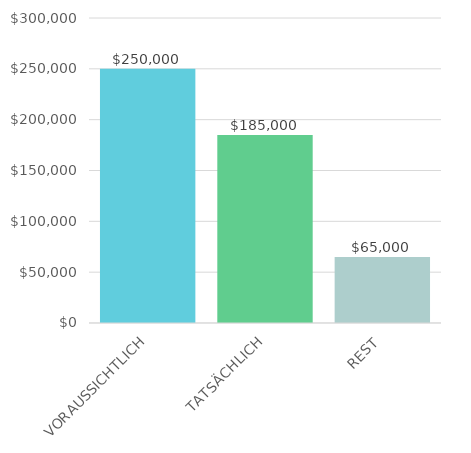
| Category | Series 0 |
|---|---|
| VORAUSSICHTLICH | 250000 |
| TATSÄCHLICH | 185000 |
| REST | 65000 |